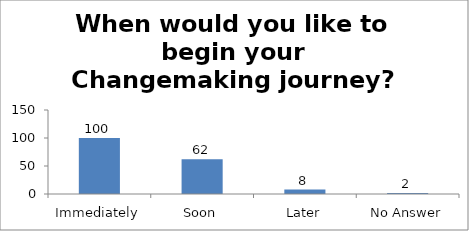
| Category | When would you like to begin your Changemaking journey?  |
|---|---|
| Immediately | 100 |
| Soon | 62 |
| Later | 8 |
| No Answer | 2 |